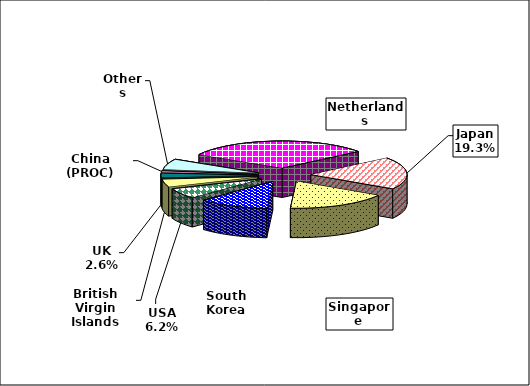
| Category | Series 0 |
|---|---|
| Netherlands | 18095.245 |
| Japan | 11179.619 |
| Singapore | 9987.979 |
| South Korea | 6839.505 |
| USA | 3580.294 |
| British Virgin Islands | 2673.302 |
| UK | 1528.103 |
| China (PROC) | 541.347 |
| Others | 3601.341 |